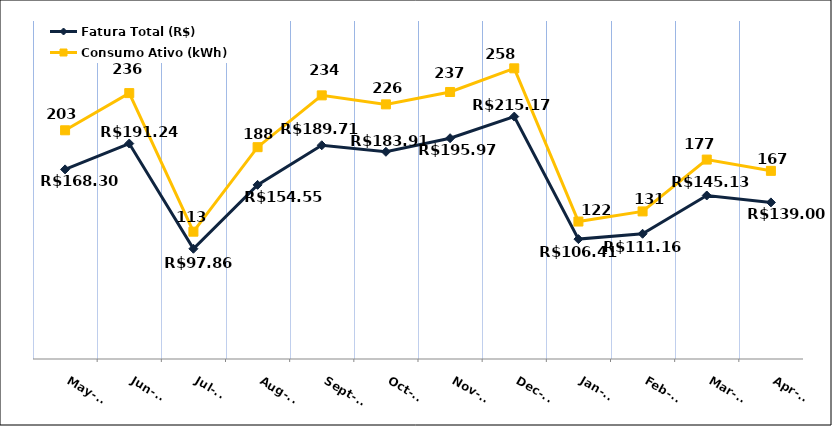
| Category | Fatura Total (R$) |
|---|---|
| 2023-05-01 | 168.3 |
| 2023-06-01 | 191.24 |
| 2023-07-01 | 97.86 |
| 2023-08-01 | 154.55 |
| 2023-09-01 | 189.71 |
| 2023-10-01 | 183.91 |
| 2023-11-01 | 195.97 |
| 2023-12-01 | 215.17 |
| 2024-01-01 | 106.41 |
| 2024-02-01 | 111.16 |
| 2024-03-01 | 145.13 |
| 2024-04-01 | 139 |